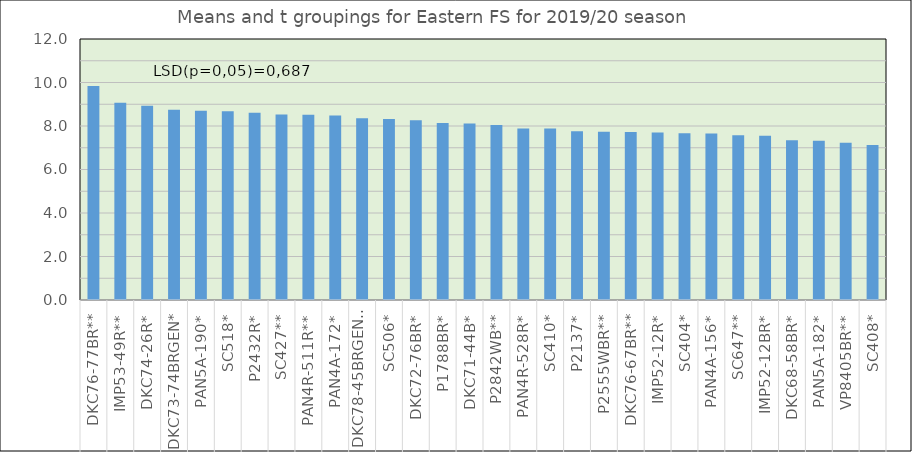
| Category | Series 0 |
|---|---|
| 0 | 9.837 |
| 1 | 9.067 |
| 2 | 8.932 |
| 3 | 8.744 |
| 4 | 8.702 |
| 5 | 8.675 |
| 6 | 8.613 |
| 7 | 8.53 |
| 8 | 8.518 |
| 9 | 8.481 |
| 10 | 8.359 |
| 11 | 8.318 |
| 12 | 8.27 |
| 13 | 8.141 |
| 14 | 8.118 |
| 15 | 8.046 |
| 16 | 7.888 |
| 17 | 7.884 |
| 18 | 7.763 |
| 19 | 7.739 |
| 20 | 7.722 |
| 21 | 7.698 |
| 22 | 7.667 |
| 23 | 7.655 |
| 24 | 7.573 |
| 25 | 7.548 |
| 26 | 7.342 |
| 27 | 7.318 |
| 28 | 7.233 |
| 29 | 7.126 |